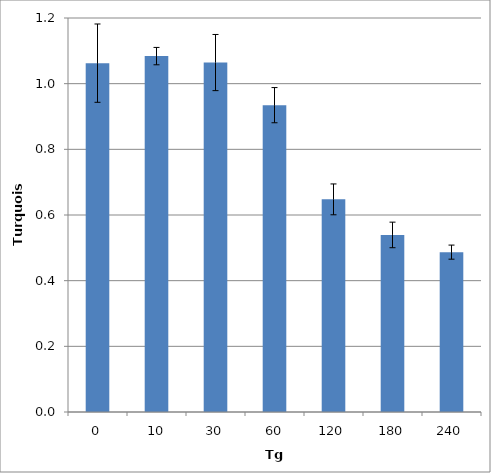
| Category | Turquoise |
|---|---|
| 0.0 | 1.062 |
| 10.0 | 1.084 |
| 30.0 | 1.064 |
| 60.0 | 0.935 |
| 120.0 | 0.648 |
| 180.0 | 0.539 |
| 240.0 | 0.487 |